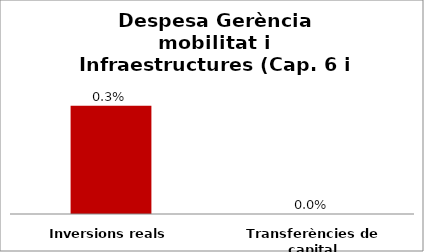
| Category | Series 0 |
|---|---|
| Inversions reals | 0.003 |
| Transferències de capital | 0 |